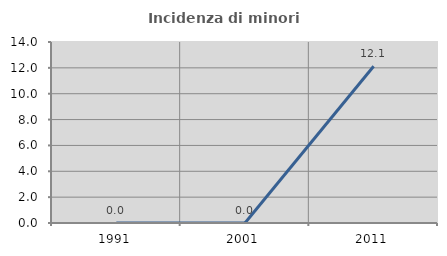
| Category | Incidenza di minori stranieri |
|---|---|
| 1991.0 | 0 |
| 2001.0 | 0 |
| 2011.0 | 12.121 |